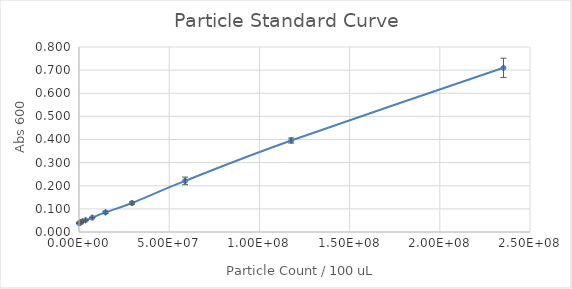
| Category | Series 0 |
|---|---|
| 235294117.64705887 | 0.71 |
| 117647058.82352944 | 0.396 |
| 58823529.41176472 | 0.221 |
| 29411764.70588236 | 0.125 |
| 14705882.35294118 | 0.085 |
| 7352941.17647059 | 0.062 |
| 3676470.588235295 | 0.051 |
| 1838235.2941176475 | 0.046 |
| 919117.6470588237 | 0.042 |
| 459558.82352941186 | 0.04 |
| 229779.41176470593 | 0.04 |
| 0.0 | 0.038 |